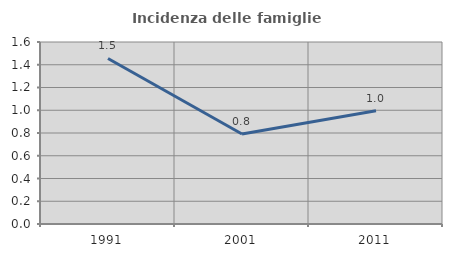
| Category | Incidenza delle famiglie numerose |
|---|---|
| 1991.0 | 1.455 |
| 2001.0 | 0.791 |
| 2011.0 | 0.996 |